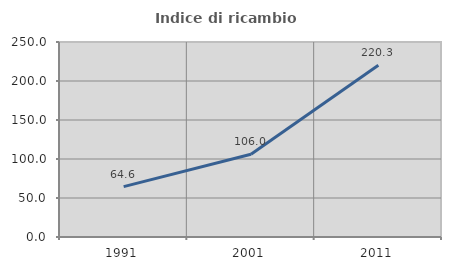
| Category | Indice di ricambio occupazionale  |
|---|---|
| 1991.0 | 64.622 |
| 2001.0 | 105.995 |
| 2011.0 | 220.321 |